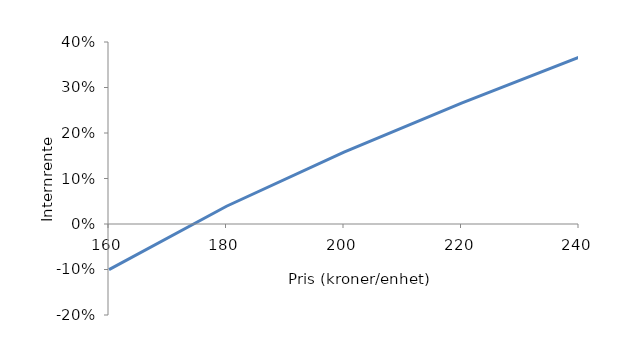
| Category | Series 0 |
|---|---|
| 160.0 | -0.1 |
| 180.0 | 0.039 |
| 200.0 | 0.158 |
| 220.0 | 0.266 |
| 240.0 | 0.367 |